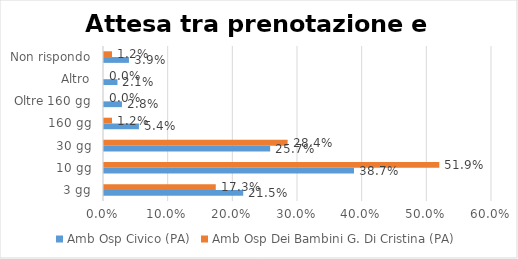
| Category | Amb Osp Civico (PA) | Amb Osp Dei Bambini G. Di Cristina (PA) |
|---|---|---|
| 3 gg | 0.215 | 0.173 |
| 10 gg | 0.387 | 0.519 |
| 30 gg | 0.257 | 0.284 |
| 160 gg | 0.054 | 0.012 |
| Oltre 160 gg | 0.028 | 0 |
| Altro | 0.021 | 0 |
| Non rispondo | 0.039 | 0.012 |